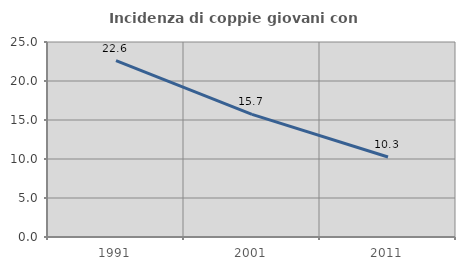
| Category | Incidenza di coppie giovani con figli |
|---|---|
| 1991.0 | 22.611 |
| 2001.0 | 15.718 |
| 2011.0 | 10.256 |